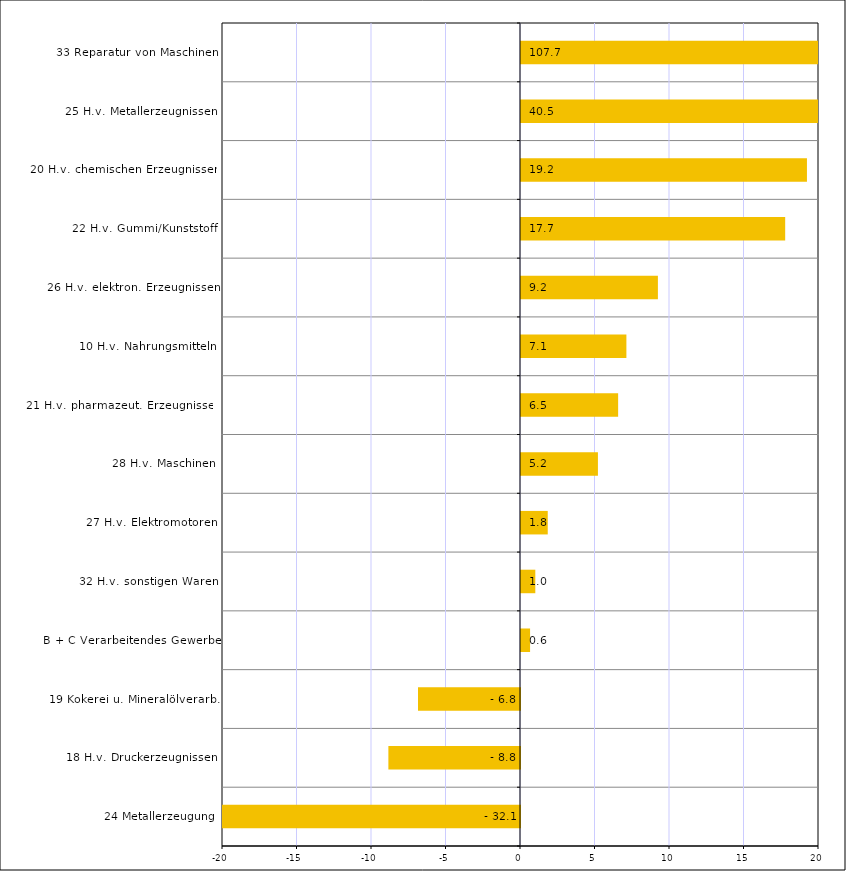
| Category | Series 0 |
|---|---|
| 24 Metallerzeugung | -32.132 |
| 18 H.v. Druckerzeugnissen | -8.834 |
| 19 Kokerei u. Mineralölverarb. | -6.845 |
| B + C Verarbeitendes Gewerbe | 0.609 |
| 32 H.v. sonstigen Waren | 0.961 |
| 27 H.v. Elektromotoren | 1.795 |
| 28 H.v. Maschinen | 5.163 |
| 21 H.v. pharmazeut. Erzeugnissen | 6.519 |
| 10 H.v. Nahrungsmitteln | 7.073 |
| 26 H.v. elektron. Erzeugnissen | 9.188 |
| 22 H.v. Gummi/Kunststoff | 17.73 |
| 20 H.v. chemischen Erzeugnissen | 19.191 |
| 25 H.v. Metallerzeugnissen | 40.457 |
| 33 Reparatur von Maschinen | 107.705 |